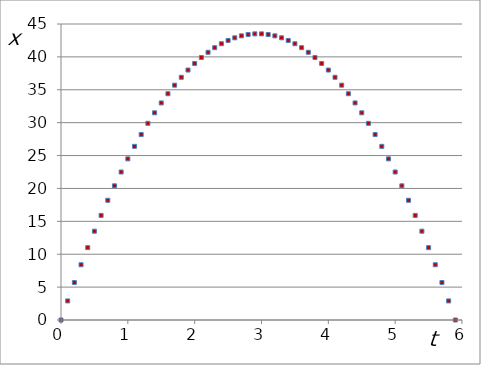
| Category | x |
|---|---|
| 0.0 | 0 |
| 0.1 | 2.9 |
| 0.2 | 5.7 |
| 0.30000000000000004 | 8.4 |
| 0.4 | 11 |
| 0.5 | 13.5 |
| 0.6 | 15.9 |
| 0.7 | 18.2 |
| 0.7999999999999999 | 20.4 |
| 0.8999999999999999 | 22.5 |
| 0.9999999999999999 | 24.5 |
| 1.0999999999999999 | 26.4 |
| 1.2 | 28.2 |
| 1.3 | 29.9 |
| 1.4000000000000001 | 31.5 |
| 1.5000000000000002 | 33 |
| 1.6000000000000003 | 34.4 |
| 1.7000000000000004 | 35.7 |
| 1.8000000000000005 | 36.9 |
| 1.9000000000000006 | 38 |
| 2.0000000000000004 | 39 |
| 2.1000000000000005 | 39.9 |
| 2.2000000000000006 | 40.7 |
| 2.3000000000000007 | 41.4 |
| 2.400000000000001 | 42 |
| 2.500000000000001 | 42.5 |
| 2.600000000000001 | 42.9 |
| 2.700000000000001 | 43.2 |
| 2.800000000000001 | 43.4 |
| 2.9000000000000012 | 43.5 |
| 3.0000000000000013 | 43.5 |
| 3.1000000000000014 | 43.4 |
| 3.2000000000000015 | 43.2 |
| 3.3000000000000016 | 42.9 |
| 3.4000000000000017 | 42.5 |
| 3.5000000000000018 | 42 |
| 3.600000000000002 | 41.4 |
| 3.700000000000002 | 40.7 |
| 3.800000000000002 | 39.9 |
| 3.900000000000002 | 39 |
| 4.000000000000002 | 38 |
| 4.100000000000001 | 36.9 |
| 4.200000000000001 | 35.7 |
| 4.300000000000001 | 34.4 |
| 4.4 | 33 |
| 4.5 | 31.5 |
| 4.6 | 29.9 |
| 4.699999999999999 | 28.2 |
| 4.799999999999999 | 26.4 |
| 4.899999999999999 | 24.5 |
| 4.999999999999998 | 22.5 |
| 5.099999999999998 | 20.4 |
| 5.1999999999999975 | 18.2 |
| 5.299999999999997 | 15.9 |
| 5.399999999999997 | 13.5 |
| 5.4999999999999964 | 11 |
| 5.599999999999996 | 8.4 |
| 5.699999999999996 | 5.7 |
| 5.799999999999995 | 2.9 |
| 5.899999999999995 | 0 |